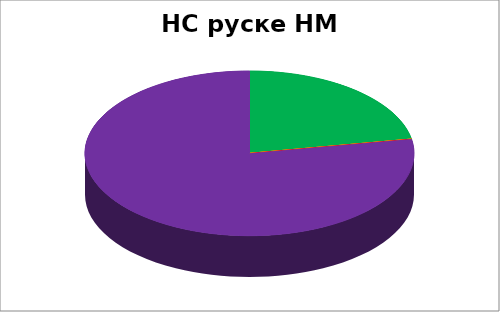
| Category | НС грчке НМ |
|---|---|
| 0 | 0.222 |
| 1 | 0 |
| 2 | 0 |
| 3 | 0 |
| 4 | 0.778 |